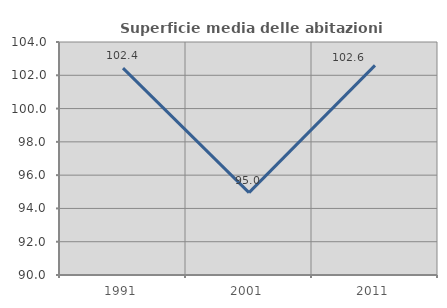
| Category | Superficie media delle abitazioni occupate |
|---|---|
| 1991.0 | 102.43 |
| 2001.0 | 94.95 |
| 2011.0 | 102.593 |